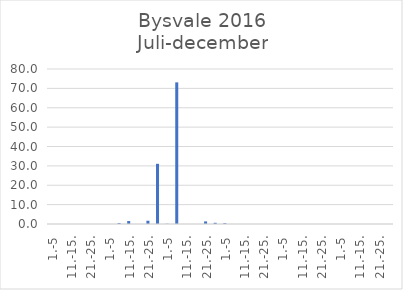
| Category | Series 0 |
|---|---|
| 1.-5 | 0 |
| 6.-10. | 0 |
| 11.-15. | 0 |
| 16.-20. | 0 |
| 21.-25. | 0 |
| 26.-31. | 0 |
| 1.-5 | 0 |
| 6.-10. | 0.478 |
| 11.-15. | 1.519 |
| 16.-20. | 0 |
| 21.-25. | 1.685 |
| 26.-31. | 31.066 |
| 1.-5 | 0.128 |
| 6.-10. | 73.103 |
| 11.-15. | 0 |
| 16.-20. | 0 |
| 21.-25. | 1.343 |
| 26.-30. | 0.624 |
| 1.-5 | 0.425 |
| 6.-10. | 0 |
| 11.-15. | 0 |
| 16.-20. | 0 |
| 21.-25. | 0 |
| 26.-31. | 0 |
| 1.-5 | 0 |
| 6.-10. | 0 |
| 11.-15. | 0 |
| 16.-20. | 0 |
| 21.-25. | 0 |
| 26.-30. | 0 |
| 1.-5 | 0 |
| 6.-10. | 0 |
| 11.-15. | 0 |
| 16.-20. | 0 |
| 21.-25. | 0 |
| 26.-31. | 0 |